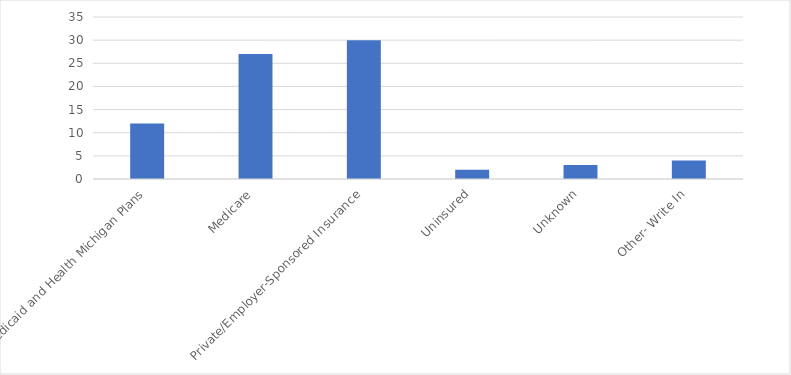
| Category | Number of Responses |
|---|---|
| Medicaid and Health Michigan Plans | 12 |
| Medicare | 27 |
| Private/Employer-Sponsored Insurance | 30 |
| Uninsured | 2 |
| Unknown | 3 |
| Other- Write In | 4 |